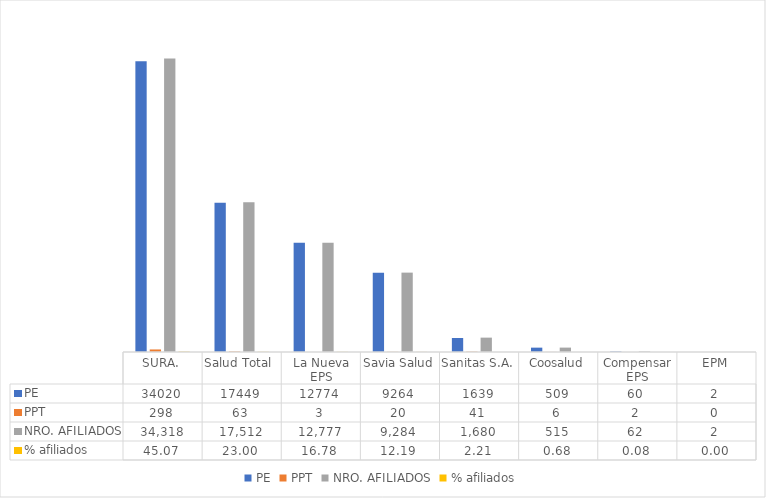
| Category | PE | PPT | NRO. AFILIADOS | % afiliados |
|---|---|---|---|---|
| SURA. | 34020 | 298 | 34318 | 45.066 |
| Salud Total  | 17449 | 63 | 17512 | 22.997 |
| La Nueva EPS | 12774 | 3 | 12777 | 16.779 |
| Savia Salud | 9264 | 20 | 9284 | 12.192 |
| Sanitas S.A. | 1639 | 41 | 1680 | 2.206 |
| Coosalud | 509 | 6 | 515 | 0.676 |
| Compensar EPS | 60 | 2 | 62 | 0.081 |
| EPM | 2 | 0 | 2 | 0.003 |